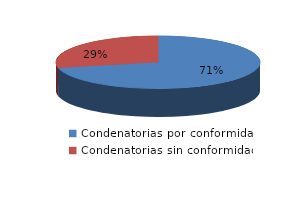
| Category | Series 0 |
|---|---|
| 0 | 10 |
| 1 | 4 |